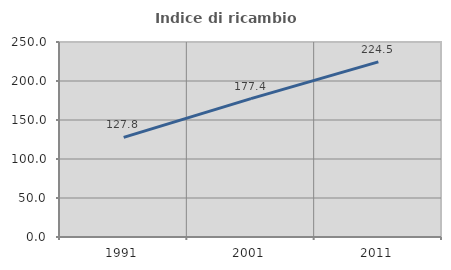
| Category | Indice di ricambio occupazionale  |
|---|---|
| 1991.0 | 127.761 |
| 2001.0 | 177.446 |
| 2011.0 | 224.51 |